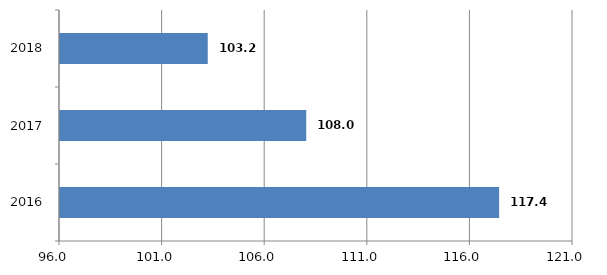
| Category | Series 0 |
|---|---|
| 2016.0 | 117.4 |
| 2017.0 | 108 |
| 2018.0 | 103.2 |